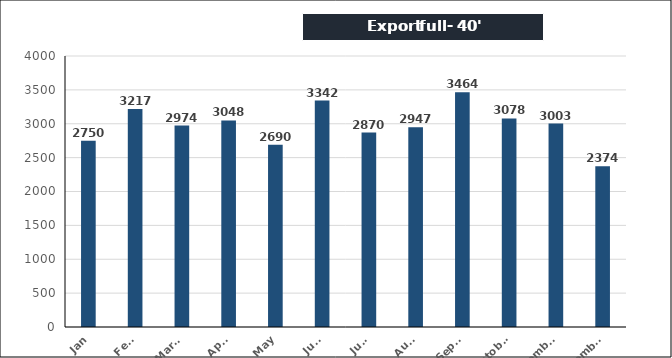
| Category | Export full - 40' |
|---|---|
| Jan | 2750 |
| Feb. | 3217 |
| March | 2974 |
| April | 3048 |
| May | 2690 |
| June | 3342 |
| July | 2870 |
| Aug. | 2947 |
| Sept. | 3464 |
| October | 3078 |
| November | 3003 |
| December | 2374 |